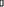
| Category | 'sun-3853'!#REF! |
|---|---|
| 0 | 1 |